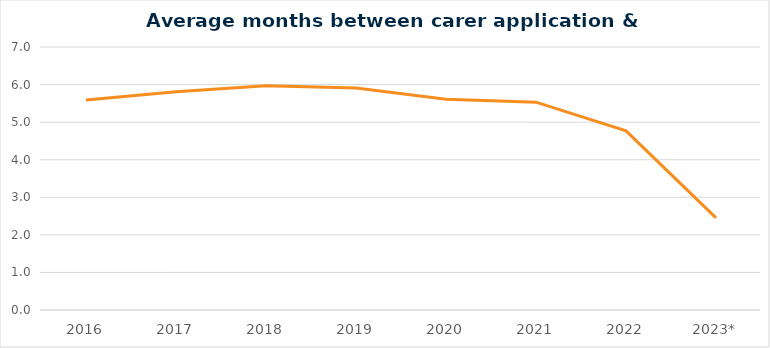
| Category | Average months btw carer
application & authorisation |
|---|---|
| 2016 | 5.59 |
| 2017 | 5.81 |
| 2018 | 5.966 |
| 2019 | 5.91 |
| 2020 | 5.61 |
| 2021 | 5.532 |
| 2022 | 4.768 |
| 2023* | 2.45 |